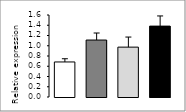
| Category | Series 0 |
|---|---|
| 0 | 0.684 |
| 1 | 1.111 |
| 2 | 0.973 |
| 3 | 1.383 |